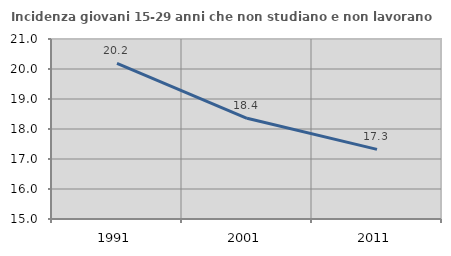
| Category | Incidenza giovani 15-29 anni che non studiano e non lavorano  |
|---|---|
| 1991.0 | 20.188 |
| 2001.0 | 18.357 |
| 2011.0 | 17.321 |